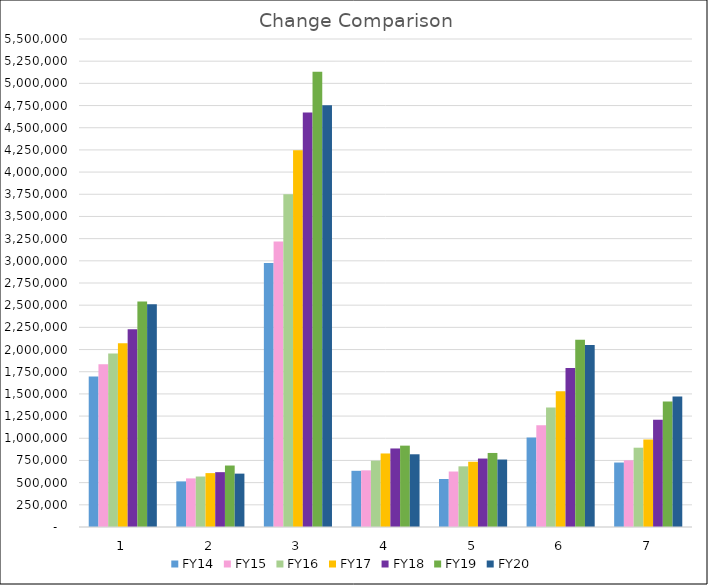
| Category | FY14 | FY15 | FY16 | FY17 | FY18 | FY19 | FY20 |
|---|---|---|---|---|---|---|---|
| 0 | 1697413.69 | 1835663.78 | 1956207.25 | 2071290.66 | 2229829.3 | 2541126.27 | 2510556.12 |
| 1 | 514097.08 | 547790.16 | 568881.38 | 607325.72 | 618106.66 | 692882.09 | 601566.44 |
| 2 | 2975568.42 | 3217944.64 | 3749759.46 | 4247363.68 | 4672464.47 | 5130377.33 | 4753977.98 |
| 3 | 633266.07 | 638402.21 | 747902.56 | 828732.03 | 885071.99 | 916975.44 | 819595 |
| 4 | 541250.65 | 625195.14 | 683574.65 | 735454.7 | 771557.81 | 834445.73 | 760499.74 |
| 5 | 1009130.99 | 1146939.29 | 1347396.33 | 1529829.21 | 1792550.87 | 2111580.03 | 2052124.34 |
| 6 | 726546.4 | 751460.76 | 893765.74 | 986386.67 | 1209719.48 | 1415464.27 | 1469798.65 |